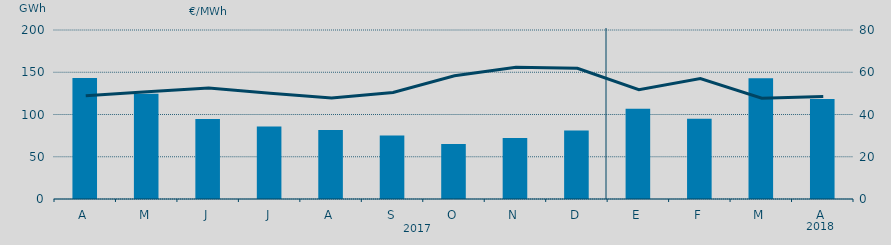
| Category | Energía a subir |
|---|---|
| A | 143332.881 |
| M | 124663.514 |
| J | 94559.541 |
| J | 85673.202 |
| A | 81536.076 |
| S | 75102.289 |
| O | 65089.595 |
| N | 72290.07 |
| D | 81049.796 |
| E | 106846.751 |
| F | 95118.279 |
| M | 142766.358 |
| A | 118380.448 |